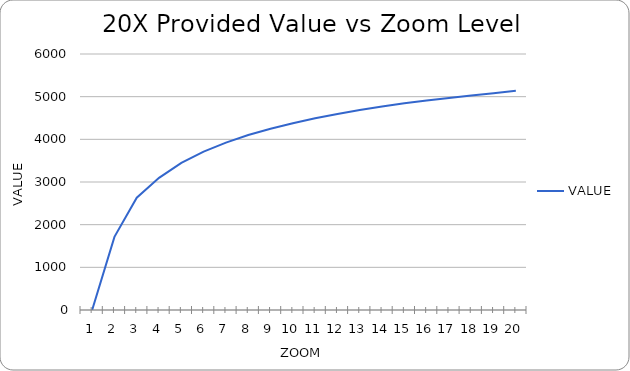
| Category | VALUE |
|---|---|
| 1.0 | 0 |
| 2.0 | 1714 |
| 3.0 | 2632 |
| 4.0 | 3098 |
| 5.0 | 3450 |
| 6.0 | 3712 |
| 7.0 | 3922 |
| 8.0 | 4100 |
| 9.0 | 4248 |
| 10.0 | 4378 |
| 11.0 | 4492 |
| 12.0 | 4594 |
| 13.0 | 4688 |
| 14.0 | 4770 |
| 15.0 | 4844 |
| 16.0 | 4912 |
| 17.0 | 4970 |
| 18.0 | 5025 |
| 19.0 | 5081 |
| 20.0 | 5140 |